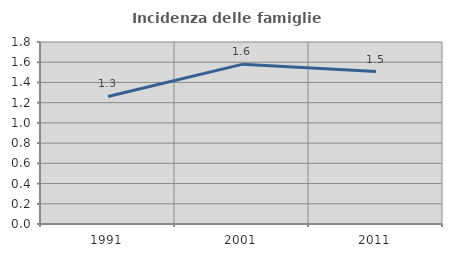
| Category | Incidenza delle famiglie numerose |
|---|---|
| 1991.0 | 1.261 |
| 2001.0 | 1.579 |
| 2011.0 | 1.508 |